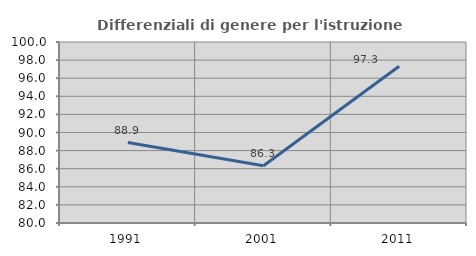
| Category | Differenziali di genere per l'istruzione superiore |
|---|---|
| 1991.0 | 88.89 |
| 2001.0 | 86.333 |
| 2011.0 | 97.318 |